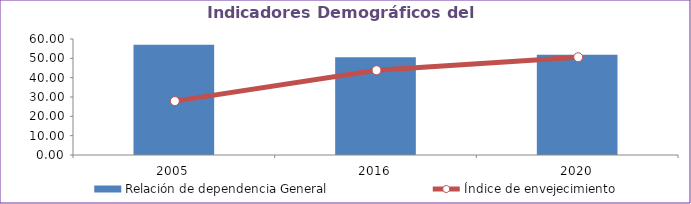
| Category | Relación de dependencia General |
|---|---|
| 2005.0 | 57.077 |
| 2016.0 | 50.497 |
| 2020.0 | 51.914 |